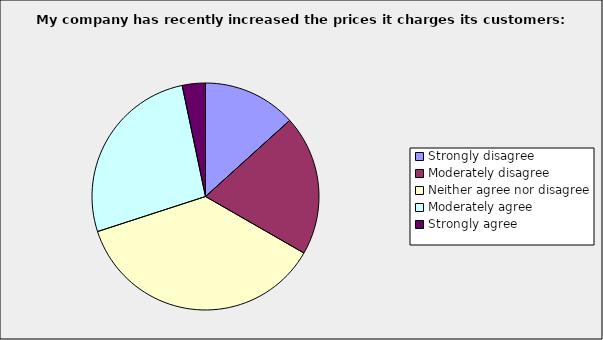
| Category | Series 0 |
|---|---|
| Strongly disagree | 0.133 |
| Moderately disagree | 0.2 |
| Neither agree nor disagree | 0.367 |
| Moderately agree | 0.267 |
| Strongly agree | 0.033 |